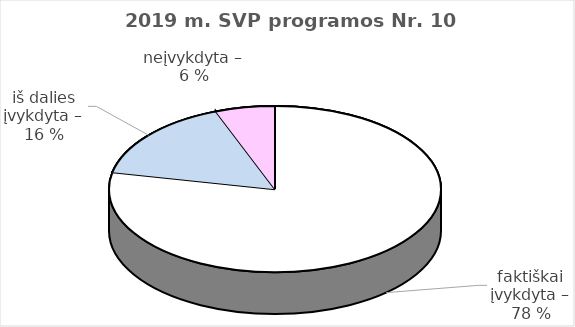
| Category | Series 0 |
|---|---|
| faktiškai įvykdyta – | 54 |
| iš dalies įvykdyta – | 11 |
| neįvykdyta – | 4 |